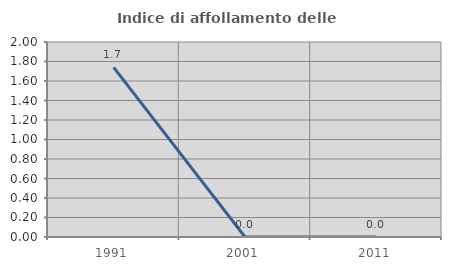
| Category | Indice di affollamento delle abitazioni  |
|---|---|
| 1991.0 | 1.739 |
| 2001.0 | 0 |
| 2011.0 | 0 |